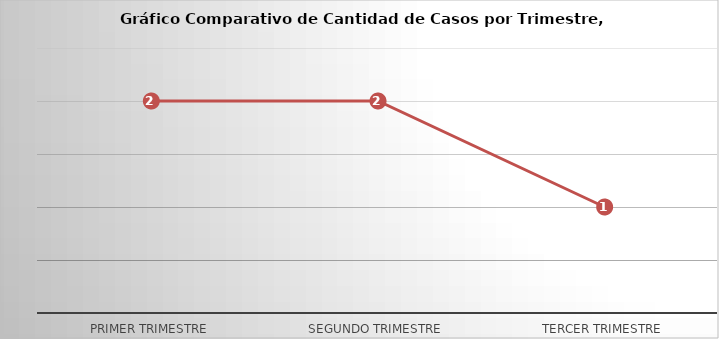
| Category | Series 0 |
|---|---|
| Primer Trimestre | 2 |
| Segundo Trimestre | 2 |
| Tercer Trimestre | 1 |